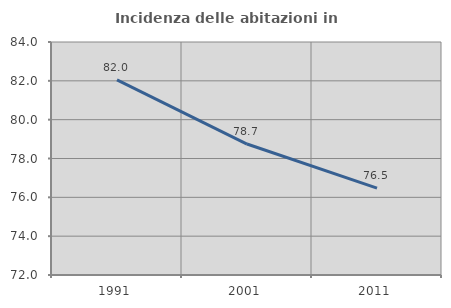
| Category | Incidenza delle abitazioni in proprietà  |
|---|---|
| 1991.0 | 82.047 |
| 2001.0 | 78.745 |
| 2011.0 | 76.478 |